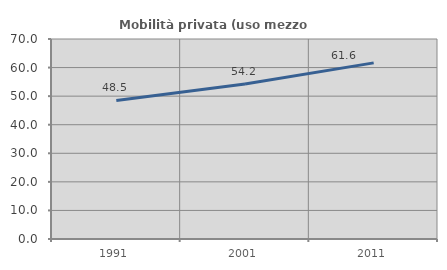
| Category | Mobilità privata (uso mezzo privato) |
|---|---|
| 1991.0 | 48.485 |
| 2001.0 | 54.219 |
| 2011.0 | 61.644 |